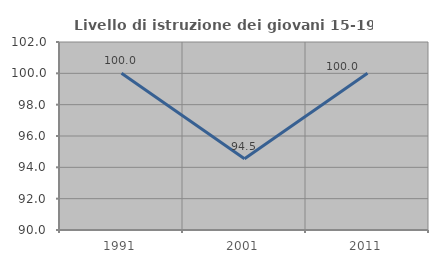
| Category | Livello di istruzione dei giovani 15-19 anni |
|---|---|
| 1991.0 | 100 |
| 2001.0 | 94.545 |
| 2011.0 | 100 |